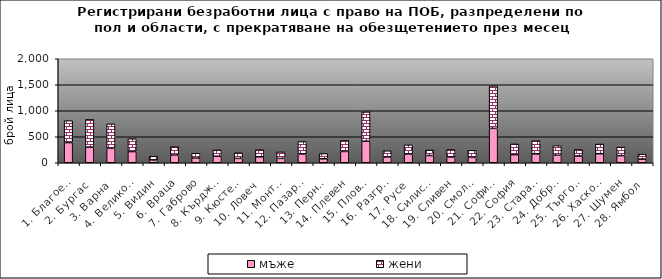
| Category | мъже | жени |
|---|---|---|
| 1. Благоевград | 388 | 421 |
| 2. Бургас | 300 | 533 |
| 3. Варна | 278 | 470 |
| 4. Велико Търново | 215 | 246 |
| 5. Видин | 52 | 71 |
| 6. Враца | 148 | 162 |
| 7. Габрово | 90 | 93 |
| 8. Кърджали | 125 | 122 |
| 9. Кюстендил | 84 | 108 |
| 10. Ловеч | 115 | 135 |
| 11. Монтана | 84 | 124 |
| 12. Пазарджик | 168 | 239 |
| 13. Перник | 77 | 99 |
| 14. Плевен | 217 | 211 |
| 15. Пловдив | 414 | 563 |
| 16. Разград | 107 | 123 |
| 17. Русе | 167 | 177 |
| 18. Силистра | 139 | 107 |
| 19. Сливен | 109 | 146 |
| 20. Смолян | 104 | 135 |
| 21. София-град | 661 | 817 |
| 22. София | 156 | 206 |
| 23. Стара Загора | 169 | 256 |
| 24. Добрич | 145 | 184 |
| 25. Търговище | 130 | 125 |
| 26. Хасково | 174 | 186 |
| 27. Шумен | 137 | 164 |
| 28. Ямбол | 71 | 96 |